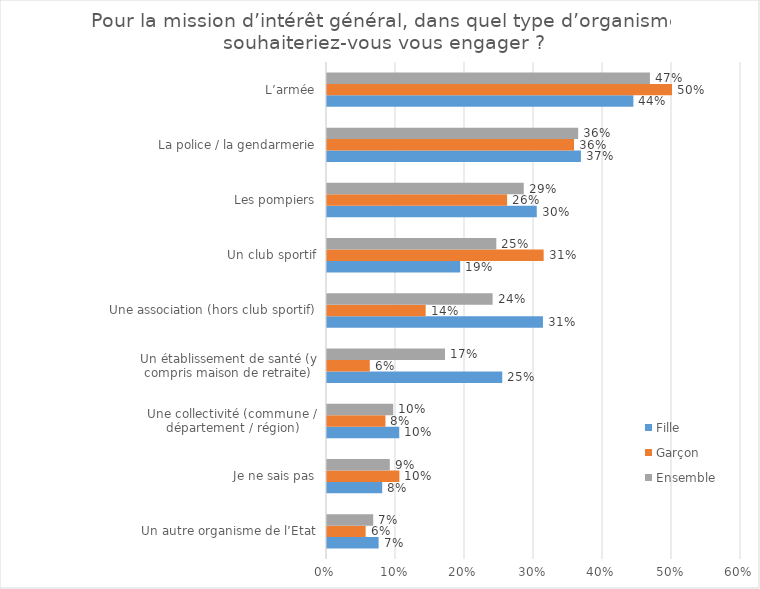
| Category | Fille | Garçon | Ensemble |
|---|---|---|---|
| Un autre organisme de l’Etat | 0.075 | 0.056 | 0.067 |
| Je ne sais pas | 0.08 | 0.105 | 0.091 |
| Une collectivité (commune / département / région) | 0.105 | 0.085 | 0.096 |
| Un établissement de santé (y compris maison de retraite) | 0.254 | 0.062 | 0.171 |
| Une association (hors club sportif) | 0.313 | 0.143 | 0.24 |
| Un club sportif | 0.193 | 0.314 | 0.245 |
| Les pompiers | 0.304 | 0.261 | 0.285 |
| La police / la gendarmerie | 0.368 | 0.358 | 0.364 |
| L’armée | 0.444 | 0.5 | 0.468 |